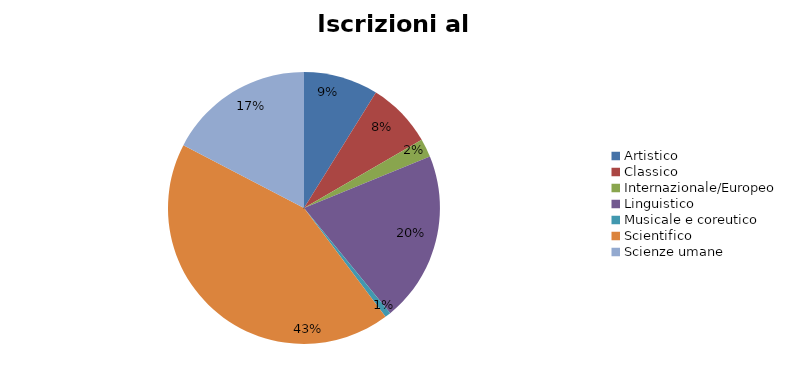
| Category | Series 0 | Series 1 |
|---|---|---|
| Artistico | 1549 |  |
| Classico | 1358 |  |
| Internazionale/Europeo | 381 |  |
| Linguistico | 3535 |  |
| Musicale e coreutico | 122 |  |
| Scientifico | 7487 |  |
| Scienze umane | 3030 |  |